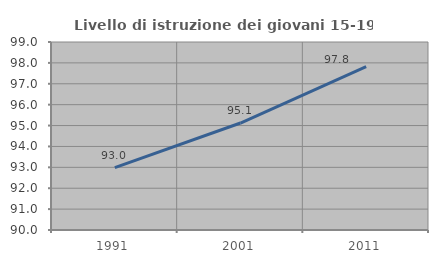
| Category | Livello di istruzione dei giovani 15-19 anni |
|---|---|
| 1991.0 | 92.982 |
| 2001.0 | 95.122 |
| 2011.0 | 97.826 |